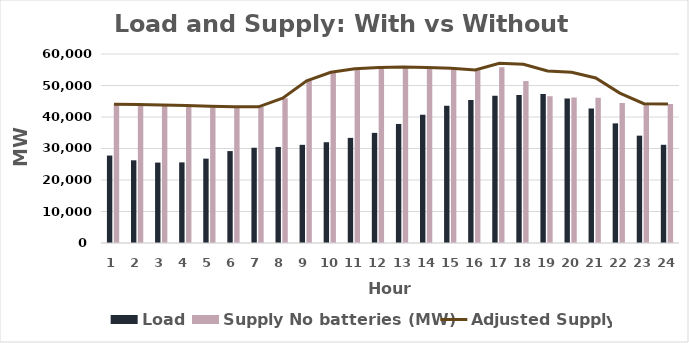
| Category | Load | Supply No batteries (MW) |
|---|---|---|
| 1.0 | 27761 | 44037.46 |
| 2.0 | 26250 | 43951.46 |
| 3.0 | 25530 | 43844.46 |
| 4.0 | 25595 | 43634.46 |
| 5.0 | 26780 | 43447.46 |
| 6.0 | 29181 | 43251.46 |
| 7.0 | 30238 | 43228.46 |
| 8.0 | 30494 | 45970.46 |
| 9.0 | 31168 | 51505.46 |
| 10.0 | 31992 | 54202.46 |
| 11.0 | 33372 | 55309.46 |
| 12.0 | 34956 | 55689.46 |
| 13.0 | 37794 | 55858.46 |
| 14.0 | 40725 | 55727.46 |
| 15.0 | 43577 | 55484.46 |
| 16.0 | 45358 | 54877.46 |
| 17.0 | 46760 | 55803.46 |
| 18.0 | 47014 | 51429.46 |
| 19.0 | 47325 | 46592.46 |
| 20.0 | 45899 | 46171.46 |
| 21.0 | 42685 | 46109.46 |
| 22.0 | 37978 | 44441.46 |
| 23.0 | 34077 | 44209.46 |
| 24.0 | 31179 | 44111.46 |